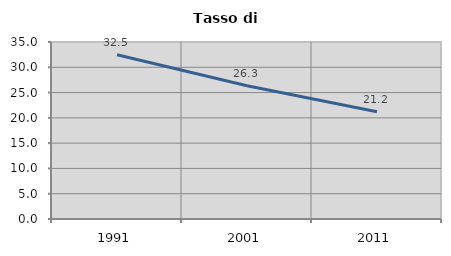
| Category | Tasso di disoccupazione   |
|---|---|
| 1991.0 | 32.467 |
| 2001.0 | 26.341 |
| 2011.0 | 21.198 |